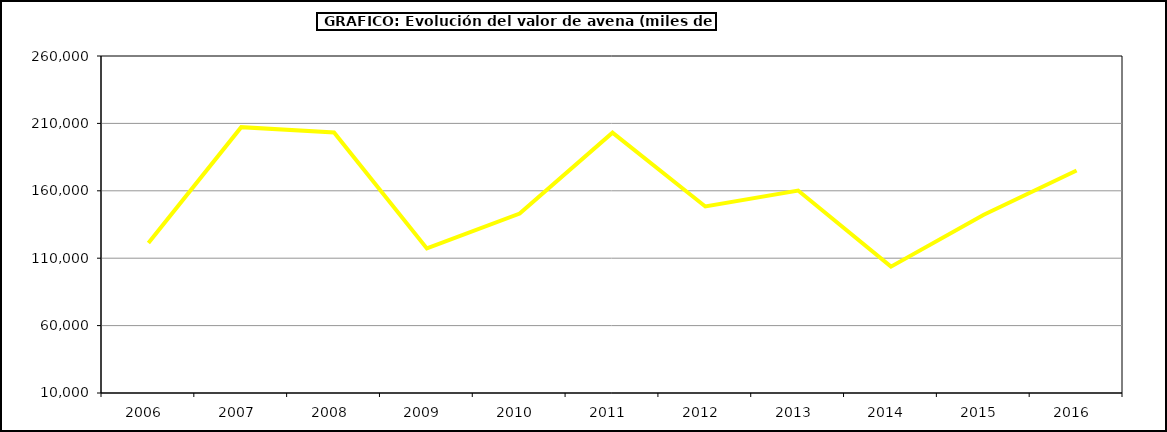
| Category | Valor |
|---|---|
| 2006.0 | 121358.72 |
| 2007.0 | 207233.299 |
| 2008.0 | 203323.263 |
| 2009.0 | 117248.747 |
| 2010.0 | 143145.142 |
| 2011.0 | 203137.341 |
| 2012.0 | 148383.942 |
| 2013.0 | 160216.853 |
| 2014.0 | 103741 |
| 2015.0 | 142229 |
| 2016.0 | 175065 |